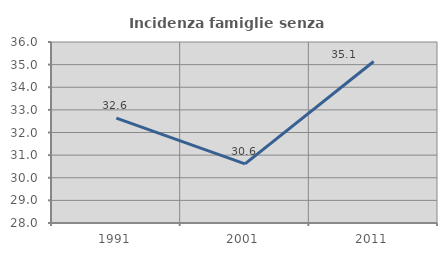
| Category | Incidenza famiglie senza nuclei |
|---|---|
| 1991.0 | 32.633 |
| 2001.0 | 30.614 |
| 2011.0 | 35.137 |